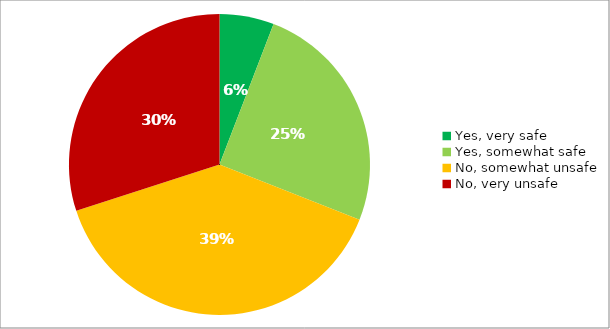
| Category | Responses |
|---|---|
| Yes, very safe | 0.058 |
| Yes, somewhat safe | 0.251 |
| No, somewhat unsafe | 0.39 |
| No, very unsafe | 0.3 |